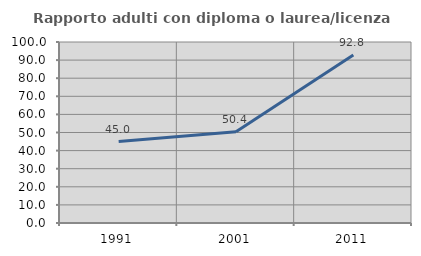
| Category | Rapporto adulti con diploma o laurea/licenza media  |
|---|---|
| 1991.0 | 45.022 |
| 2001.0 | 50.423 |
| 2011.0 | 92.79 |